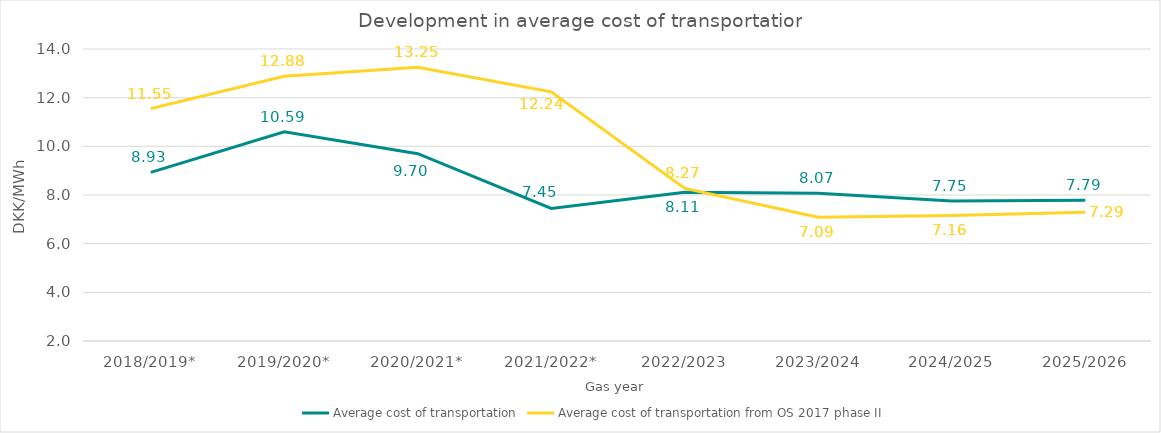
| Category | Average cost of transportation | Average cost of transportation from OS 2017 phase II |
|---|---|---|
| 2018/2019* | 8.93 | 11.55 |
| 2019/2020* | 10.595 | 12.88 |
| 2020/2021* | 9.696 | 13.25 |
| 2021/2022* | 7.447 | 12.24 |
| 2022/2023 | 8.114 | 8.27 |
| 2023/2024 | 8.072 | 7.09 |
| 2024/2025 | 7.754 | 7.16 |
| 2025/2026 | 7.787 | 7.29 |